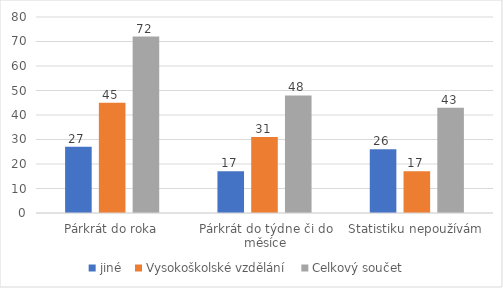
| Category | jiné | Vysokoškolské vzdělání | Celkový součet |
|---|---|---|---|
| Párkrát do roka | 27 | 45 | 72 |
| Párkrát do týdne či do měsíce | 17 | 31 | 48 |
| Statistiku nepoužívám | 26 | 17 | 43 |